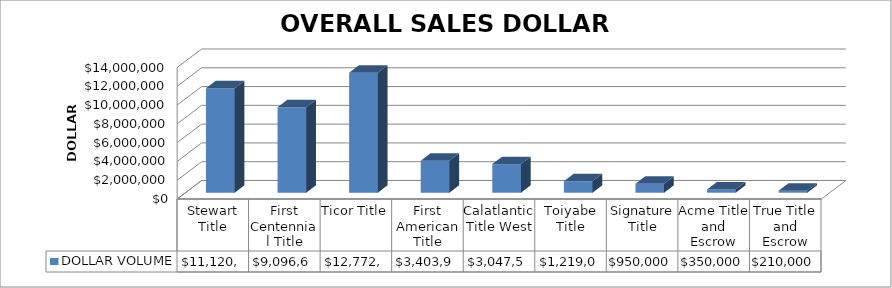
| Category | DOLLAR VOLUME |
|---|---|
| Stewart Title | 11120964.08 |
| First Centennial Title | 9096652 |
| Ticor Title | 12772000 |
| First American Title | 3403997 |
| Calatlantic Title West | 3047559 |
| Toiyabe Title | 1219000 |
| Signature Title | 950000 |
| Acme Title and Escrow | 350000 |
| True Title and Escrow | 210000 |